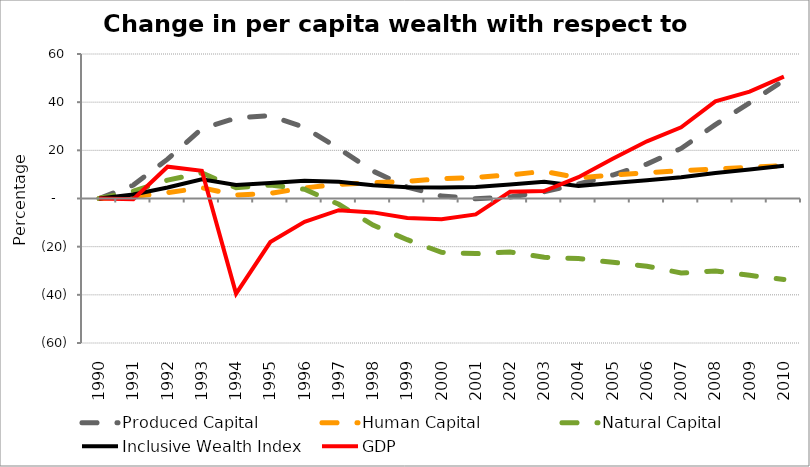
| Category | Produced Capital  | Human Capital | Natural Capital | Inclusive Wealth Index | GDP |
|---|---|---|---|---|---|
| 1990.0 | 0 | 0 | 0 | 0 | 0 |
| 1991.0 | 5.578 | 0.886 | 3.052 | 1.656 | -0.31 |
| 1992.0 | 16.331 | 2.411 | 7.625 | 4.584 | 13.211 |
| 1993.0 | 28.975 | 4.464 | 10.604 | 8.012 | 11.537 |
| 1994.0 | 33.398 | 1.462 | 4.51 | 5.633 | -39.509 |
| 1995.0 | 34.416 | 2.155 | 5.563 | 6.398 | -18.098 |
| 1996.0 | 29.516 | 4.397 | 3.841 | 7.408 | -9.698 |
| 1997.0 | 20.729 | 5.849 | -2.422 | 6.908 | -4.849 |
| 1998.0 | 11.385 | 6.551 | -11.022 | 5.536 | -5.764 |
| 1999.0 | 4.75 | 7.169 | -17.105 | 4.658 | -8.118 |
| 2000.0 | 1.019 | 8.196 | -22.351 | 4.533 | -8.582 |
| 2001.0 | -0.081 | 8.767 | -22.885 | 4.799 | -6.619 |
| 2002.0 | 0.643 | 9.826 | -22.228 | 5.781 | 2.813 |
| 2003.0 | 2.823 | 11.268 | -24.397 | 6.983 | 3.084 |
| 2004.0 | 6 | 8.571 | -24.933 | 5.199 | 8.833 |
| 2005.0 | 9.749 | 9.74 | -26.485 | 6.435 | 16.461 |
| 2006.0 | 14.271 | 10.729 | -28.128 | 7.614 | 23.738 |
| 2007.0 | 20.789 | 11.538 | -30.922 | 8.79 | 29.584 |
| 2008.0 | 30.677 | 12.22 | -30.081 | 10.609 | 40.303 |
| 2009.0 | 39.755 | 12.905 | -31.905 | 12.087 | 44.362 |
| 2010.0 | 49.006 | 13.643 | -33.631 | 13.638 | 50.618 |